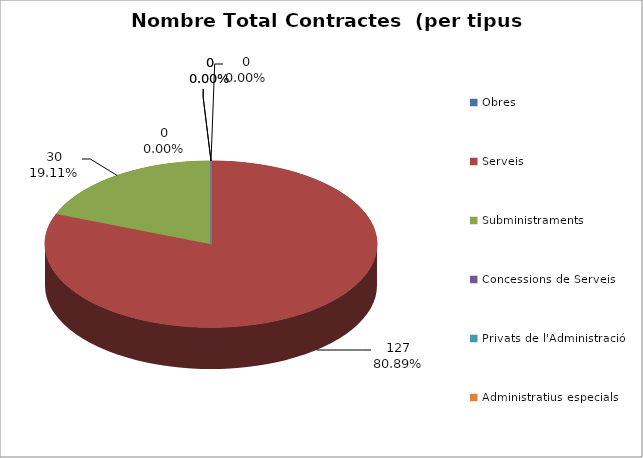
| Category | Nombre Total Contractes |
|---|---|
| Obres | 0 |
| Serveis | 127 |
| Subministraments | 30 |
| Concessions de Serveis | 0 |
| Privats de l'Administració | 0 |
| Administratius especials | 0 |